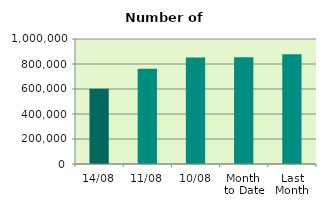
| Category | Series 0 |
|---|---|
| 14/08 | 602964 |
| 11/08 | 762406 |
| 10/08 | 852918 |
| Month 
to Date | 854766.4 |
| Last
Month | 877151.619 |